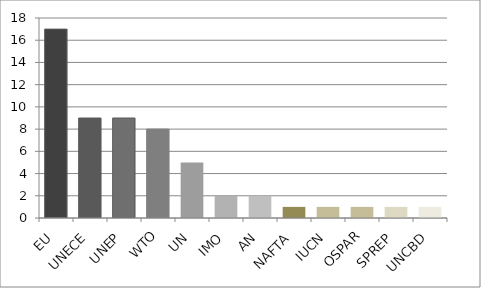
| Category | Series 0 |
|---|---|
| EU | 17 |
| UNECE | 9 |
| UNEP | 9 |
| WTO | 8 |
| UN | 5 |
| IMO | 2 |
| AN | 2 |
| NAFTA | 1 |
| IUCN | 1 |
| OSPAR | 1 |
| SPREP | 1 |
| UNCBD | 1 |